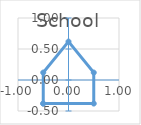
| Category | School |
|---|---|
| -0.5 | -0.38 |
| 0.5 | -0.38 |
| 0.5 | 0.12 |
| 0.0 | 0.62 |
| -0.5 | 0.12 |
| -0.5 | -0.38 |